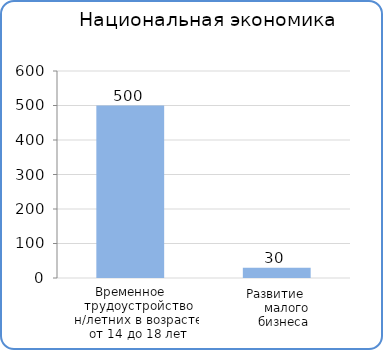
| Category | Расходы |
|---|---|
| Временное трудоустройство несовершеннолетних в возрасте от 14 до 18 лет | 500000 |
| Развитие малого бинеса | 30000 |